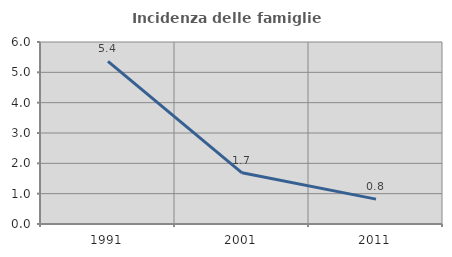
| Category | Incidenza delle famiglie numerose |
|---|---|
| 1991.0 | 5.359 |
| 2001.0 | 1.688 |
| 2011.0 | 0.821 |